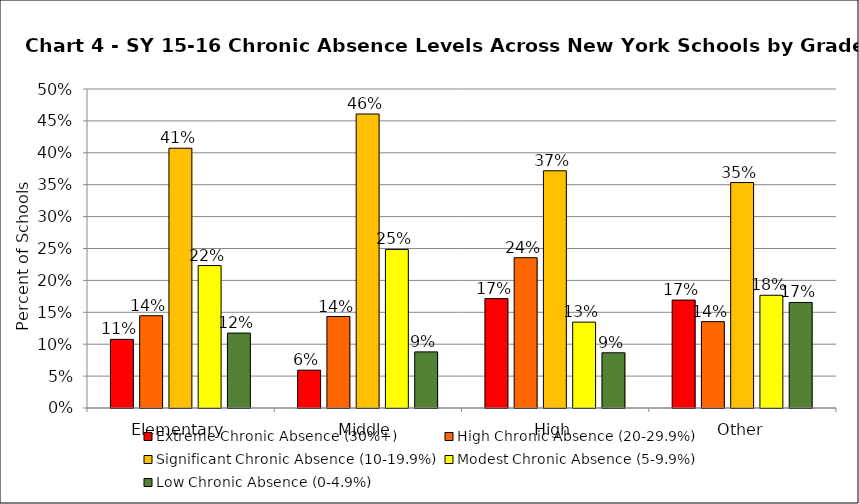
| Category | Extreme Chronic Absence (30%+) | High Chronic Absence (20-29.9%) | Significant Chronic Absence (10-19.9%) | Modest Chronic Absence (5-9.9%) | Low Chronic Absence (0-4.9%) |
|---|---|---|---|---|---|
| 0 | 0.108 | 0.145 | 0.407 | 0.223 | 0.117 |
| 1 | 0.059 | 0.143 | 0.461 | 0.249 | 0.088 |
| 2 | 0.171 | 0.236 | 0.372 | 0.135 | 0.087 |
| 3 | 0.169 | 0.135 | 0.353 | 0.177 | 0.165 |